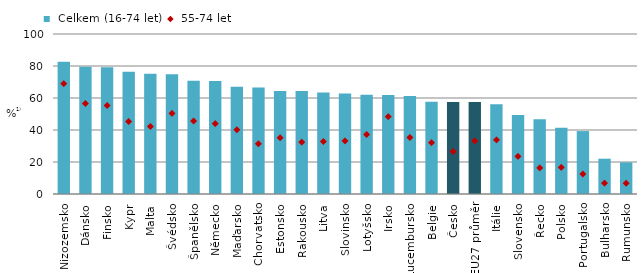
| Category |  Celkem (16-74 let) |
|---|---|
| Nizozemsko | 82.614 |
| Dánsko | 79.57 |
| Finsko | 79.266 |
| Kypr | 76.448 |
| Malta | 75.092 |
| Švédsko | 74.908 |
| Španělsko | 70.735 |
| Německo | 70.667 |
| Maďarsko | 67.022 |
| Chorvatsko | 66.502 |
| Estonsko | 64.447 |
| Rakousko | 64.297 |
| Litva | 63.505 |
| Slovinsko | 62.889 |
| Lotyšsko | 62.074 |
| Irsko | 61.927 |
| Lucembursko | 61.274 |
| Belgie | 57.68 |
| Česko | 57.484 |
| EU27 průměr | 57.473 |
| Itálie | 56.131 |
| Slovensko | 49.441 |
| Řecko | 46.648 |
| Polsko | 41.458 |
| Portugalsko | 39.328 |
| Bulharsko | 22.065 |
| Rumunsko | 19.796 |